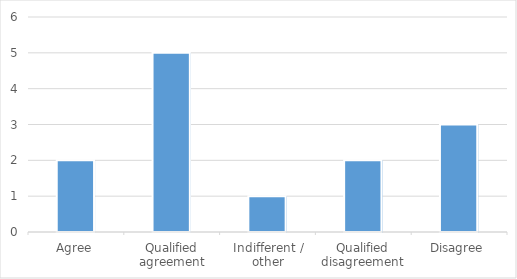
| Category | Series 0 |
|---|---|
| Agree | 2 |
| Qualified agreement | 5 |
| Indifferent / other | 1 |
| Qualified disagreement | 2 |
| Disagree | 3 |